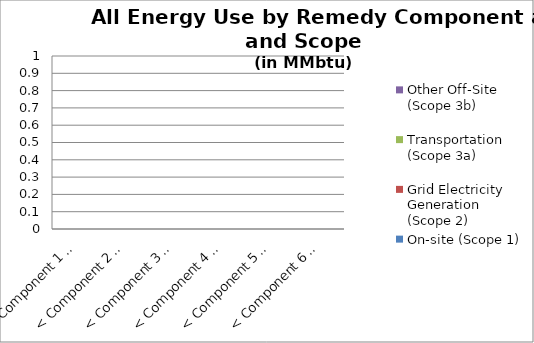
| Category | On-site (Scope 1) | Grid Electricity Generation (Scope 2) | Transportation (Scope 3a) | Other Off-Site (Scope 3b) |
|---|---|---|---|---|
| < Component 1 > | 0 | 0 | 0 | 0 |
| < Component 2 > | 0 | 0 | 0 | 0 |
| < Component 3 > | 0 | 0 | 0 | 0 |
| < Component 4 > | 0 | 0 | 0 | 0 |
| < Component 5 > | 0 | 0 | 0 | 0 |
| < Component 6 > | 0 | 0 | 0 | 0 |